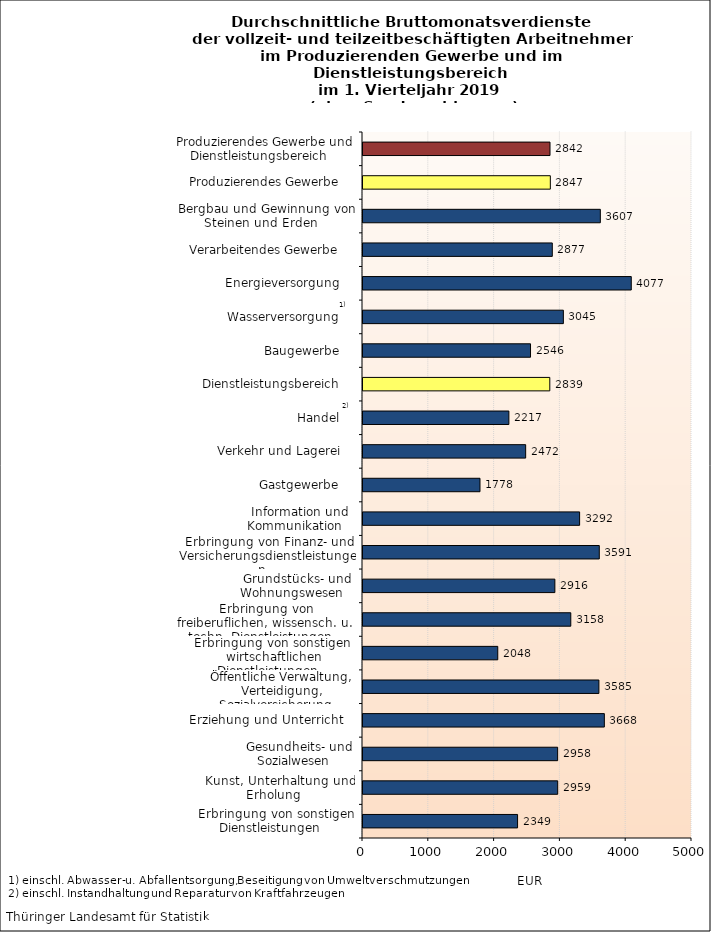
| Category | Series 0 |
|---|---|
| Erbringung von sonstigen Dienstleistungen    | 2349 |
| Kunst, Unterhaltung und Erholung    | 2959 |
| Gesundheits- und Sozialwesen    | 2958 |
| Erziehung und Unterricht    | 3668 |
| Öffentliche Verwaltung, Verteidigung, Sozialversicherung    | 3585 |
| Erbringung von sonstigen  wirtschaftlichen Dienstleistungen    | 2048 |
| Erbringung von freiberuflichen, wissensch. u. techn. Dienstleistungen    | 3158 |
| Grundstücks- und Wohnungswesen    | 2916 |
| Erbringung von Finanz- und Versicherungsdienstleistungen    | 3591 |
| Information und Kommunikation    | 3292 |
| Gastgewerbe    | 1778 |
| Verkehr und Lagerei    | 2472 |
| Handel    | 2217 |
| Dienstleistungsbereich    | 2839 |
| Baugewerbe    | 2546 |
| Wasserversorgung    | 3045 |
| Energieversorgung    | 4077 |
| Verarbeitendes Gewerbe    | 2877 |
| Bergbau und Gewinnung von Steinen und Erden    | 3607 |
| Produzierendes Gewerbe    | 2847 |
| Produzierendes Gewerbe und Dienstleistungsbereich    | 2842 |